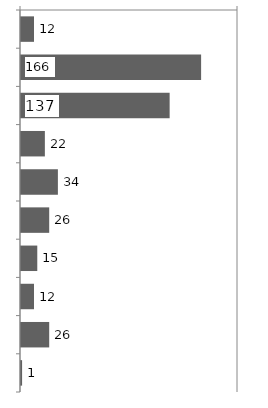
| Category | Series 0 |
|---|---|
| 0 | 12 |
| 1 | 166 |
| 2 | 137 |
| 3 | 22 |
| 4 | 34 |
| 5 | 26 |
| 6 | 15 |
| 7 | 12 |
| 8 | 26 |
| 9 | 1 |